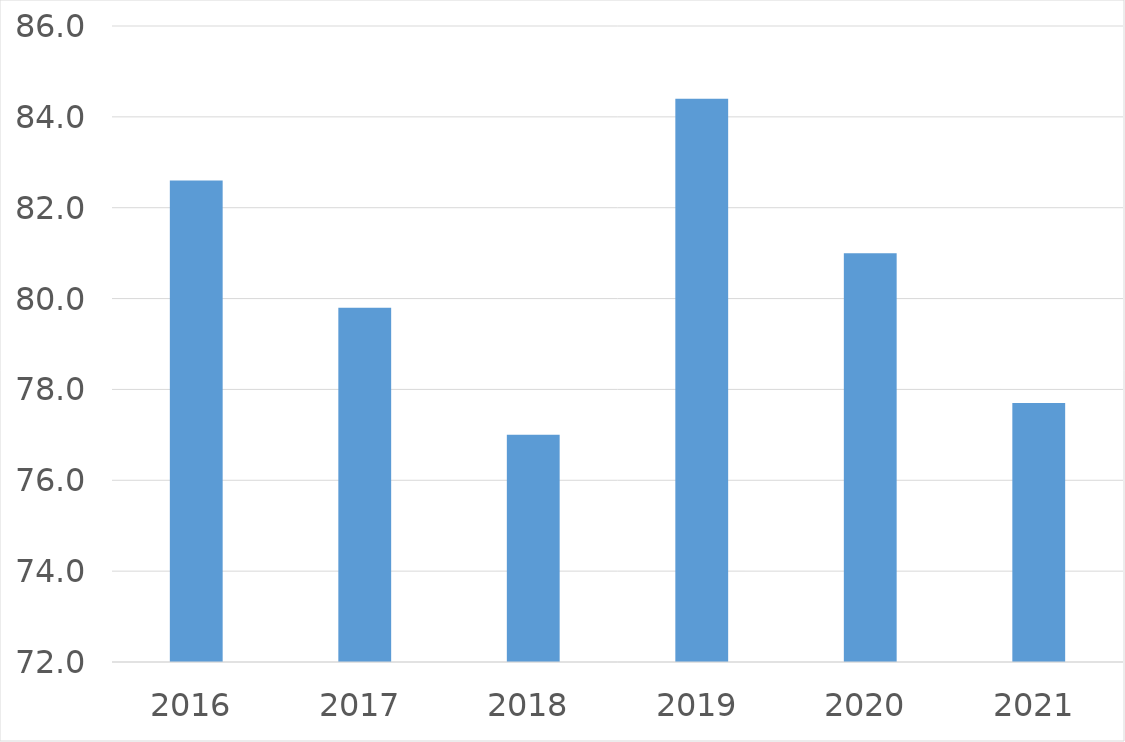
| Category | Series 0 |
|---|---|
| 2016 | 82.6 |
| 2017 | 79.8 |
| 2018 | 77 |
| 2019 | 84.4 |
| 2020 | 81 |
| 2021 | 77.7 |